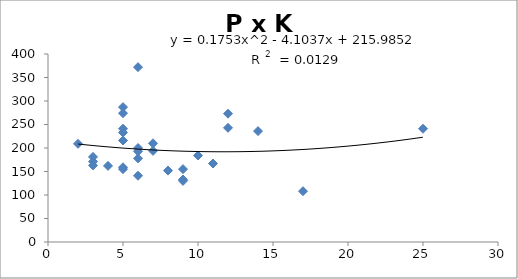
| Category | Series 0 |
|---|---|
| 14.0 | 236 |
| 7.0 | 210 |
| 6.0 | 200 |
| 3.0 | 181 |
| 3.0 | 171 |
| 5.0 | 287 |
| 5.0 | 241 |
| 25.0 | 241 |
| 17.0 | 108 |
| 9.0 | 130 |
| 4.0 | 162 |
| 2.0 | 209 |
| 5.0 | 233 |
| 12.0 | 243 |
| 5.0 | 216 |
| 3.0 | 163 |
| 6.0 | 372 |
| 12.0 | 273 |
| 11.0 | 167 |
| 9.0 | 133 |
| 5.0 | 155 |
| 6.0 | 178 |
| 6.0 | 193 |
| 5.0 | 274 |
| 9.0 | 155 |
| 6.0 | 141 |
| 7.0 | 194 |
| 10.0 | 184 |
| 8.0 | 152 |
| 5.0 | 159 |